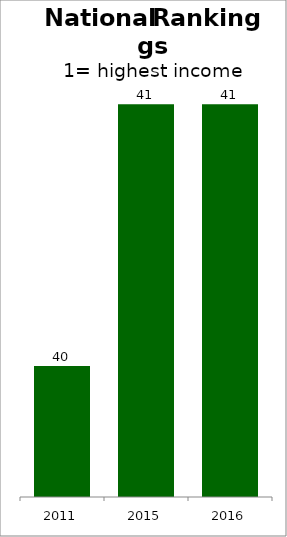
| Category | Series 0 |
|---|---|
| 2011.0 | 40 |
| 2015.0 | 41 |
| 2016.0 | 41 |